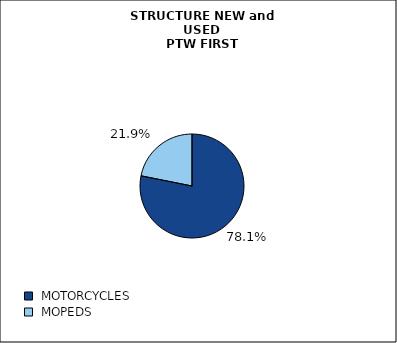
| Category | TOTAL |
|---|---|
|  MOTORCYCLES  | 0.781 |
|  MOPEDS  | 0.219 |